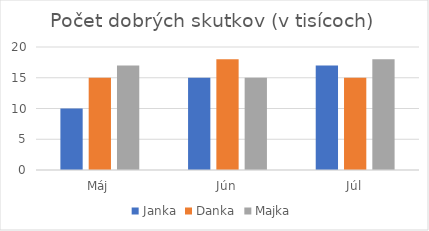
| Category | Janka | Danka | Majka |
|---|---|---|---|
| Máj | 10 | 15 | 17 |
| Jún | 15 | 18 | 15 |
| Júl | 17 | 15 | 18 |